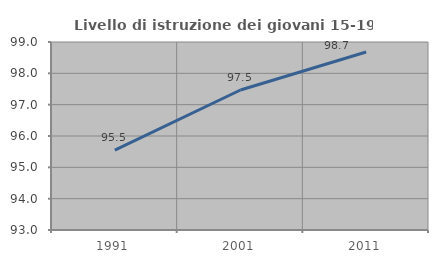
| Category | Livello di istruzione dei giovani 15-19 anni |
|---|---|
| 1991.0 | 95.546 |
| 2001.0 | 97.468 |
| 2011.0 | 98.68 |